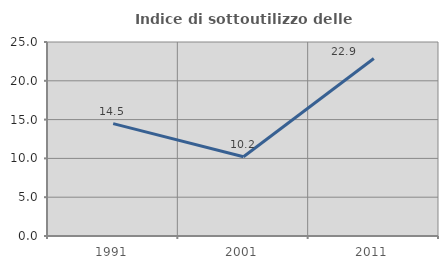
| Category | Indice di sottoutilizzo delle abitazioni  |
|---|---|
| 1991.0 | 14.486 |
| 2001.0 | 10.204 |
| 2011.0 | 22.876 |